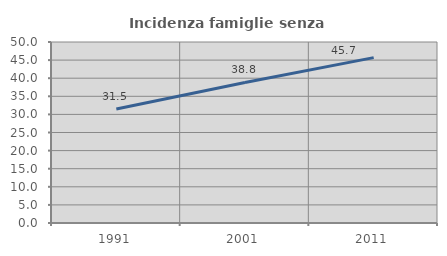
| Category | Incidenza famiglie senza nuclei |
|---|---|
| 1991.0 | 31.487 |
| 2001.0 | 38.822 |
| 2011.0 | 45.676 |